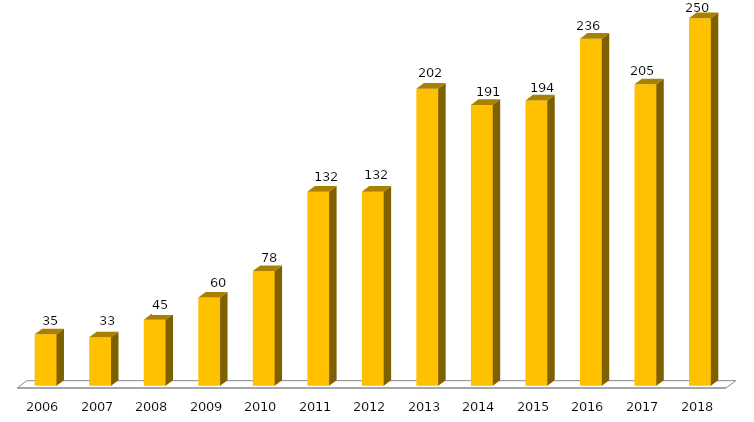
| Category | Programa |
|---|---|
| 2006.0 | 35 |
| 2007.0 | 33 |
| 2008.0 | 45 |
| 2009.0 | 60 |
| 2010.0 | 78 |
| 2011.0 | 132 |
| 2012.0 | 132 |
| 2013.0 | 202 |
| 2014.0 | 191 |
| 2015.0 | 194 |
| 2016.0 | 236 |
| 2017.0 | 205 |
| 2018.0 | 250 |